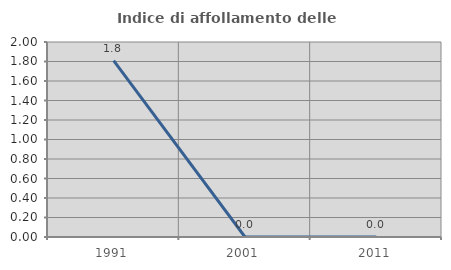
| Category | Indice di affollamento delle abitazioni  |
|---|---|
| 1991.0 | 1.81 |
| 2001.0 | 0 |
| 2011.0 | 0 |